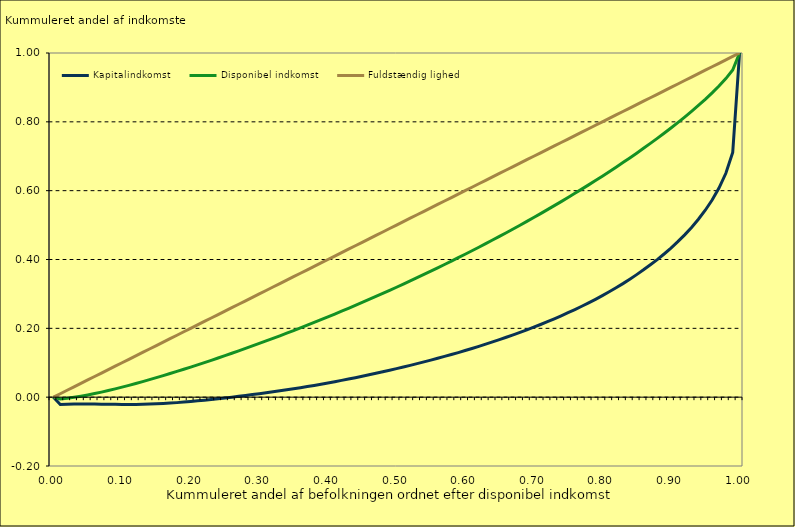
| Category | Kapitalindkomst | Disponibel indkomst | Fuldstændig lighed |
|---|---|---|---|
| 0.0 | 0 | 0 | 0 |
| 0.01 | -0.021 | -0.005 | 0.01 |
| 0.02 | -0.02 | -0.003 | 0.02 |
| 0.03 | -0.02 | -0.001 | 0.03 |
| 0.04 | -0.02 | 0.003 | 0.04 |
| 0.05 | -0.02 | 0.006 | 0.05 |
| 0.06 | -0.02 | 0.01 | 0.06 |
| 0.07 | -0.02 | 0.015 | 0.07 |
| 0.08 | -0.021 | 0.019 | 0.08 |
| 0.09 | -0.021 | 0.024 | 0.09 |
| 0.1 | -0.021 | 0.029 | 0.1 |
| 0.11 | -0.021 | 0.034 | 0.11 |
| 0.12 | -0.021 | 0.04 | 0.12 |
| 0.13 | -0.021 | 0.045 | 0.13 |
| 0.14 | -0.02 | 0.051 | 0.14 |
| 0.15 | -0.019 | 0.057 | 0.15 |
| 0.16 | -0.018 | 0.063 | 0.16 |
| 0.17 | -0.017 | 0.069 | 0.17 |
| 0.18 | -0.016 | 0.075 | 0.18 |
| 0.19 | -0.014 | 0.081 | 0.19 |
| 0.2 | -0.013 | 0.087 | 0.2 |
| 0.21 | -0.011 | 0.094 | 0.21 |
| 0.22 | -0.009 | 0.1 | 0.22 |
| 0.23 | -0.007 | 0.107 | 0.23 |
| 0.24 | -0.005 | 0.114 | 0.24 |
| 0.25 | -0.002 | 0.121 | 0.25 |
| 0.26 | 0 | 0.128 | 0.26 |
| 0.27 | 0.002 | 0.135 | 0.27 |
| 0.28 | 0.005 | 0.142 | 0.28 |
| 0.29 | 0.008 | 0.149 | 0.29 |
| 0.3 | 0.01 | 0.156 | 0.3 |
| 0.31 | 0.013 | 0.163 | 0.31 |
| 0.32 | 0.016 | 0.171 | 0.32 |
| 0.33 | 0.019 | 0.178 | 0.33 |
| 0.34 | 0.021 | 0.186 | 0.34 |
| 0.35 | 0.024 | 0.194 | 0.35 |
| 0.36 | 0.028 | 0.201 | 0.36 |
| 0.37 | 0.031 | 0.209 | 0.37 |
| 0.38 | 0.034 | 0.217 | 0.38 |
| 0.39 | 0.038 | 0.225 | 0.39 |
| 0.4 | 0.041 | 0.233 | 0.4 |
| 0.41 | 0.045 | 0.241 | 0.41 |
| 0.42 | 0.049 | 0.25 | 0.42 |
| 0.43 | 0.053 | 0.258 | 0.43 |
| 0.44 | 0.057 | 0.267 | 0.44 |
| 0.45 | 0.061 | 0.275 | 0.45 |
| 0.46 | 0.065 | 0.284 | 0.46 |
| 0.47 | 0.07 | 0.293 | 0.47 |
| 0.48 | 0.074 | 0.301 | 0.48 |
| 0.49 | 0.078 | 0.31 | 0.49 |
| 0.5 | 0.083 | 0.319 | 0.5 |
| 0.51 | 0.088 | 0.329 | 0.51 |
| 0.52 | 0.092 | 0.338 | 0.52 |
| 0.53 | 0.098 | 0.347 | 0.53 |
| 0.54 | 0.103 | 0.357 | 0.54 |
| 0.55 | 0.108 | 0.366 | 0.55 |
| 0.56 | 0.113 | 0.376 | 0.56 |
| 0.57 | 0.118 | 0.385 | 0.57 |
| 0.58 | 0.124 | 0.395 | 0.58 |
| 0.59 | 0.13 | 0.405 | 0.59 |
| 0.6 | 0.135 | 0.415 | 0.6 |
| 0.61 | 0.141 | 0.425 | 0.61 |
| 0.62 | 0.148 | 0.436 | 0.62 |
| 0.63 | 0.154 | 0.446 | 0.63 |
| 0.64 | 0.161 | 0.457 | 0.64 |
| 0.65 | 0.167 | 0.467 | 0.65 |
| 0.66 | 0.174 | 0.478 | 0.66 |
| 0.67 | 0.181 | 0.489 | 0.67 |
| 0.68 | 0.188 | 0.5 | 0.68 |
| 0.69 | 0.196 | 0.511 | 0.69 |
| 0.7 | 0.203 | 0.522 | 0.7 |
| 0.71 | 0.211 | 0.533 | 0.71 |
| 0.72 | 0.219 | 0.545 | 0.72 |
| 0.73 | 0.228 | 0.556 | 0.73 |
| 0.74 | 0.236 | 0.568 | 0.74 |
| 0.75 | 0.245 | 0.58 | 0.75 |
| 0.76 | 0.255 | 0.592 | 0.76 |
| 0.77 | 0.264 | 0.604 | 0.77 |
| 0.78 | 0.274 | 0.617 | 0.78 |
| 0.79 | 0.284 | 0.629 | 0.79 |
| 0.8 | 0.295 | 0.642 | 0.8 |
| 0.81 | 0.306 | 0.655 | 0.81 |
| 0.82 | 0.318 | 0.668 | 0.82 |
| 0.83 | 0.33 | 0.682 | 0.83 |
| 0.84 | 0.343 | 0.695 | 0.84 |
| 0.85 | 0.356 | 0.709 | 0.85 |
| 0.86 | 0.37 | 0.723 | 0.86 |
| 0.87 | 0.385 | 0.737 | 0.87 |
| 0.88 | 0.4 | 0.752 | 0.88 |
| 0.89 | 0.416 | 0.767 | 0.89 |
| 0.9 | 0.433 | 0.782 | 0.9 |
| 0.91 | 0.452 | 0.798 | 0.91 |
| 0.92 | 0.472 | 0.814 | 0.92 |
| 0.93 | 0.493 | 0.83 | 0.93 |
| 0.94 | 0.517 | 0.848 | 0.94 |
| 0.95 | 0.543 | 0.865 | 0.95 |
| 0.96 | 0.573 | 0.884 | 0.96 |
| 0.97 | 0.608 | 0.904 | 0.97 |
| 0.98 | 0.651 | 0.926 | 0.98 |
| 0.99 | 0.711 | 0.95 | 0.99 |
| 1.0 | 1 | 1 | 1 |